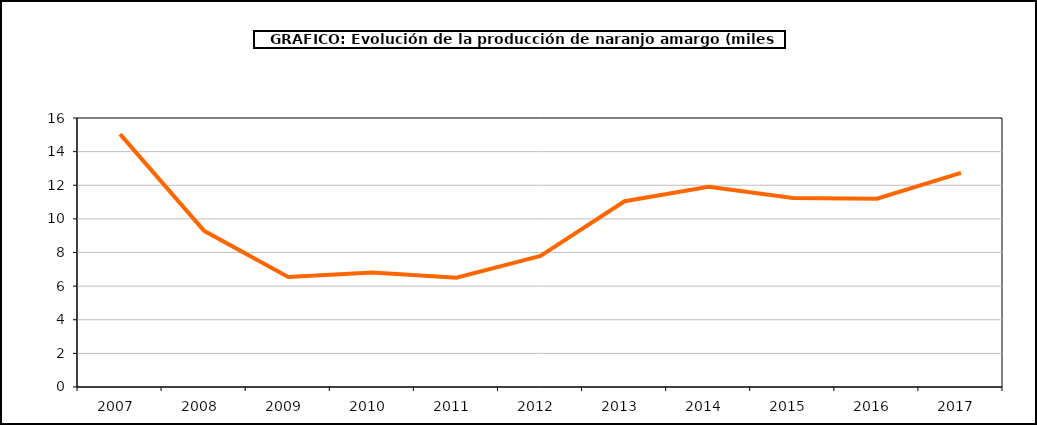
| Category | producción |
|---|---|
| 2007.0 | 15.038 |
| 2008.0 | 9.287 |
| 2009.0 | 6.545 |
| 2010.0 | 6.81 |
| 2011.0 | 6.501 |
| 2012.0 | 7.798 |
| 2013.0 | 11.051 |
| 2014.0 | 11.915 |
| 2015.0 | 11.247 |
| 2016.0 | 11.197 |
| 2017.0 | 12.735 |